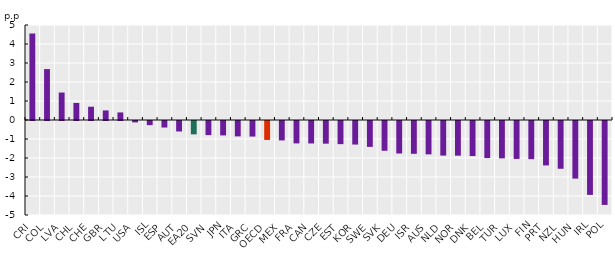
| Category | Inactivity rate  |
|---|---|
| CRI | 4.553 |
| COL | 2.68 |
| LVA | 1.445 |
| CHL | 0.899 |
| CHE | 0.699 |
| GBR | 0.504 |
| LTU | 0.399 |
| USA | -0.073 |
| ISL | -0.218 |
| ESP | -0.344 |
| AUT | -0.551 |
| EA20 | -0.702 |
| SVN | -0.743 |
| JPN | -0.758 |
| ITA | -0.81 |
| GRC | -0.819 |
| OECD | -0.997 |
| MEX | -1.022 |
| FRA | -1.179 |
| CAN | -1.182 |
| CZE | -1.193 |
| EST | -1.218 |
| KOR | -1.239 |
| SWE | -1.363 |
| SVK | -1.567 |
| DEU | -1.71 |
| ISR | -1.727 |
| AUS | -1.756 |
| NLD | -1.821 |
| NOR | -1.825 |
| DNK | -1.846 |
| BEL | -1.951 |
| TUR | -1.966 |
| LUX | -1.997 |
| FIN | -2.009 |
| PRT | -2.337 |
| NZL | -2.514 |
| HUN | -3.032 |
| IRL | -3.89 |
| POL | -4.417 |